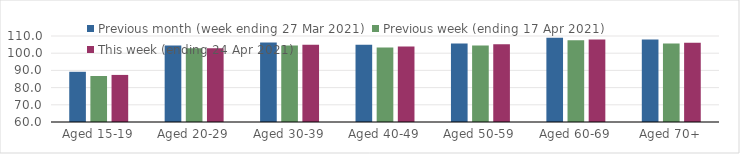
| Category | Previous month (week ending 27 Mar 2021) | Previous week (ending 17 Apr 2021) | This week (ending 24 Apr 2021) |
|---|---|---|---|
| Aged 15-19 | 89.19 | 86.74 | 87.37 |
| Aged 20-29 | 104.51 | 102.89 | 102.89 |
| Aged 30-39 | 106.23 | 104.52 | 104.91 |
| Aged 40-49 | 104.95 | 103.27 | 103.85 |
| Aged 50-59 | 105.68 | 104.53 | 105.16 |
| Aged 60-69 | 108.91 | 107.52 | 108.01 |
| Aged 70+ | 107.94 | 105.61 | 106.13 |